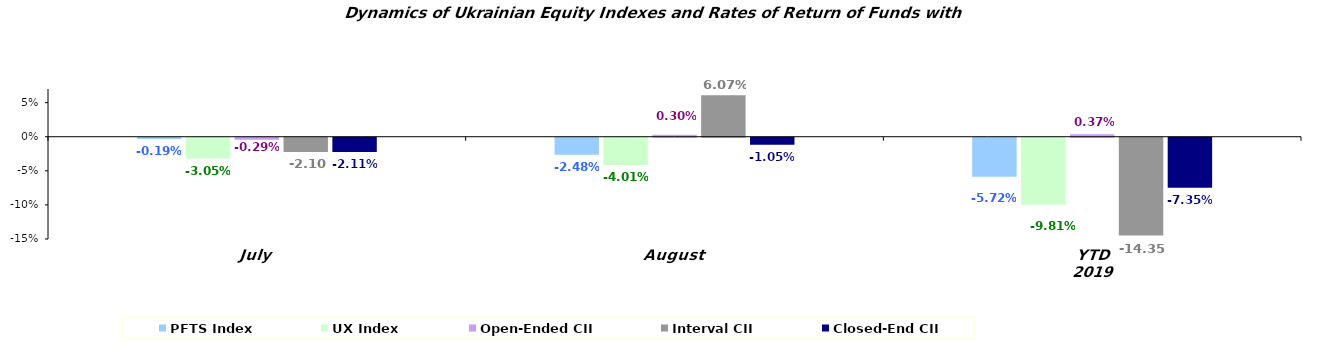
| Category | PFTS Index | UX Index | Open-Ended CII | Interval CII | Closed-End CII |
|---|---|---|---|---|---|
| July | -0.002 | -0.031 | -0.003 | -0.021 | -0.021 |
| August | -0.025 | -0.04 | 0.003 | 0.061 | -0.01 |
| YTD 2019 | -0.057 | -0.098 | 0.004 | -0.143 | -0.073 |